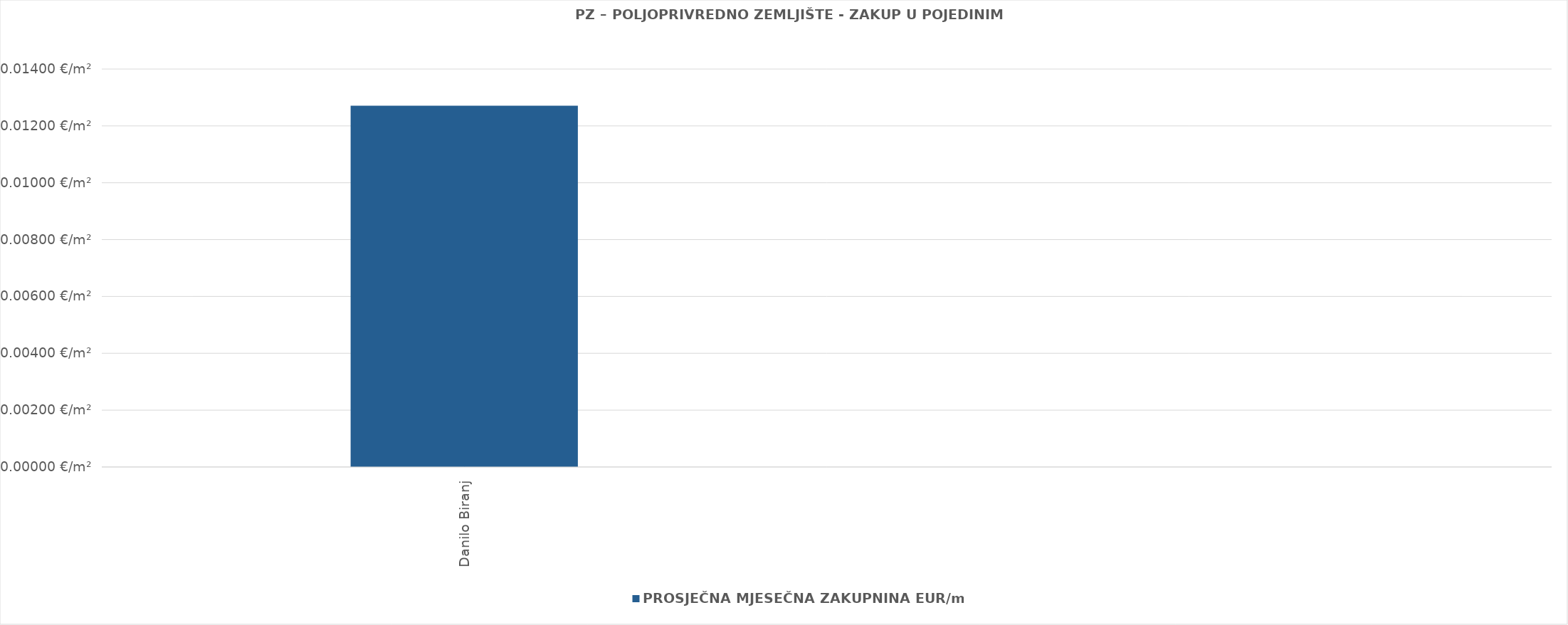
| Category | PROSJEČNA MJESEČNA ZAKUPNINA EUR/m² |
|---|---|
| Danilo Biranj | 0.013 |